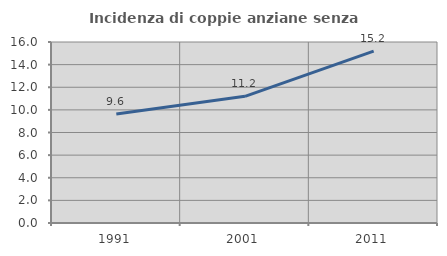
| Category | Incidenza di coppie anziane senza figli  |
|---|---|
| 1991.0 | 9.626 |
| 2001.0 | 11.199 |
| 2011.0 | 15.197 |